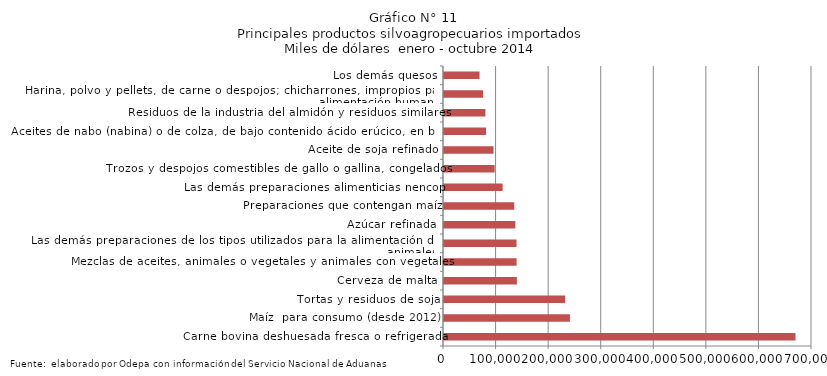
| Category | Series 0 |
|---|---|
| Carne bovina deshuesada fresca o refrigerada | 668614.407 |
| Maíz  para consumo (desde 2012) | 239515.68 |
| Tortas y residuos de soja | 230520.317 |
| Cerveza de malta | 138632.219 |
| Mezclas de aceites, animales o vegetales y animales con vegetales | 138116.156 |
| Las demás preparaciones de los tipos utilizados para la alimentación de los animales | 137987.393 |
| Azúcar refinada | 135714.58 |
| Preparaciones que contengan maíz | 133597.539 |
| Las demás preparaciones alimenticias nencop | 111539.372 |
| Trozos y despojos comestibles de gallo o gallina, congelados | 96334.138 |
| Aceite de soja refinado | 94225.753 |
| Aceites de nabo (nabina) o de colza, de bajo contenido ácido erúcico, en bruto | 79980.721 |
| Residuos de la industria del almidón y residuos similares | 78748.139 |
| Harina, polvo y pellets, de carne o despojos; chicharrones, impropios para la alimentación humana | 74399.347 |
| Los demás quesos | 67582.994 |